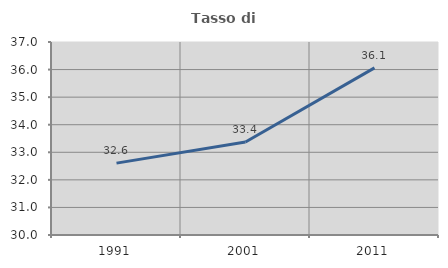
| Category | Tasso di occupazione   |
|---|---|
| 1991.0 | 32.606 |
| 2001.0 | 33.374 |
| 2011.0 | 36.06 |